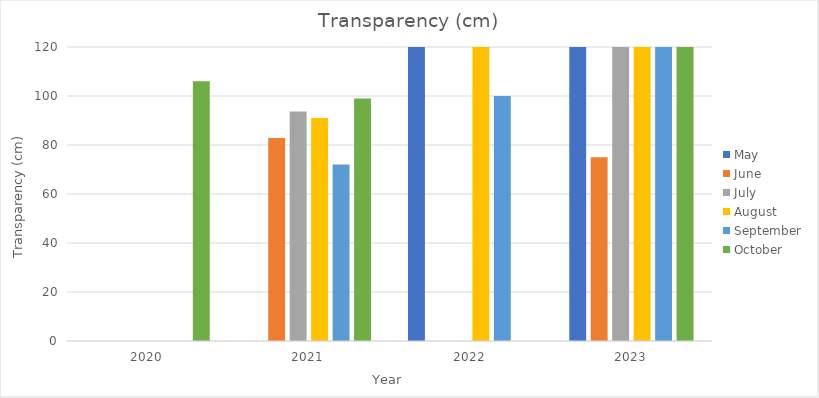
| Category | May | June | July | August | September | October |
|---|---|---|---|---|---|---|
| 2020.0 | 0 | 0 | 0 | 0 | 0 | 106 |
| 2021.0 | 0 | 82.9 | 93.7 | 91 | 72 | 99 |
| 2022.0 | 120 | 0 | 0 | 120 | 100 | 0 |
| 2023.0 | 120 | 75 | 120 | 120 | 120 | 120 |